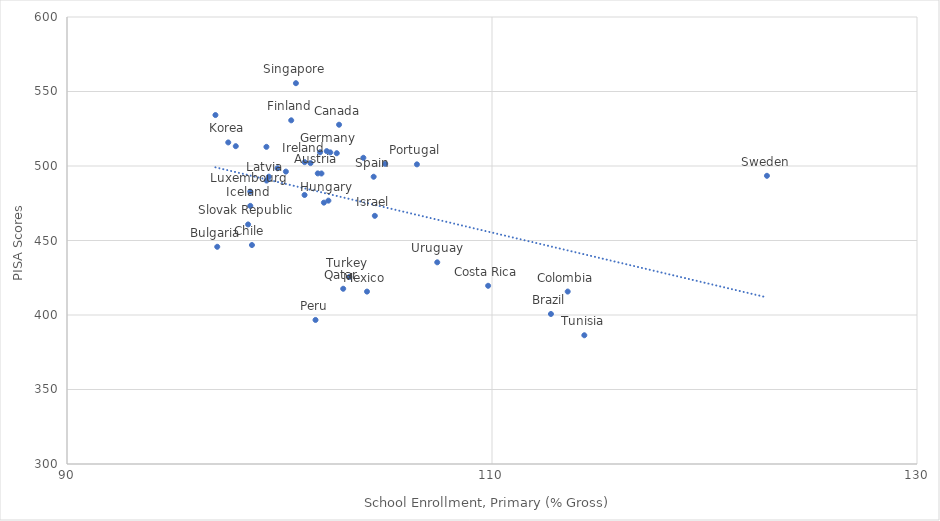
| Category | Series 0 |
|---|---|
| 102.22319 | 509.994 |
| 101.8011 | 495.037 |
| 112.77329 | 400.682 |
| 97.07002 | 445.772 |
| 102.80303 | 527.705 |
| 98.70303 | 446.956 |
| 113.56272 | 415.729 |
| 109.81741 | 419.608 |
| 99.49798 | 492.83 |
| 101.46172 | 501.937 |
| 96.9854299999999 | 534.194 |
| 100.55111 | 530.661 |
| 101.97449 | 494.978 |
| 102.38905 | 509.141 |
| 102.3013 | 476.748 |
| 98.6254299999999 | 473.23 |
| 101.18464 | 502.575 |
| 104.48587 | 466.553 |
| 101.1794 | 480.547 |
| 97.58806 | 515.81 |
| 99.39332 | 490.225 |
| 102.08926 | 475.409 |
| 98.6271299999999 | 482.806 |
| 104.11754 | 415.71 |
| 102.69498 | 508.575 |
| 97.94278 | 513.304 |
| 99.90401 | 498.481 |
| 101.69511 | 396.684 |
| 104.97503 | 501.435 |
| 106.46703 | 501.1 |
| 102.99762 | 417.611 |
| 100.77321 | 555.575 |
| 98.52261 | 460.775 |
| 99.38422 | 512.864 |
| 104.43106 | 492.786 |
| 122.93879 | 493.422 |
| 103.94662 | 505.506 |
| 114.34463 | 386.403 |
| 103.28537 | 425.49 |
| 101.90924 | 509.222 |
| 100.29991 | 496.242 |
| 107.42318 | 435.363 |